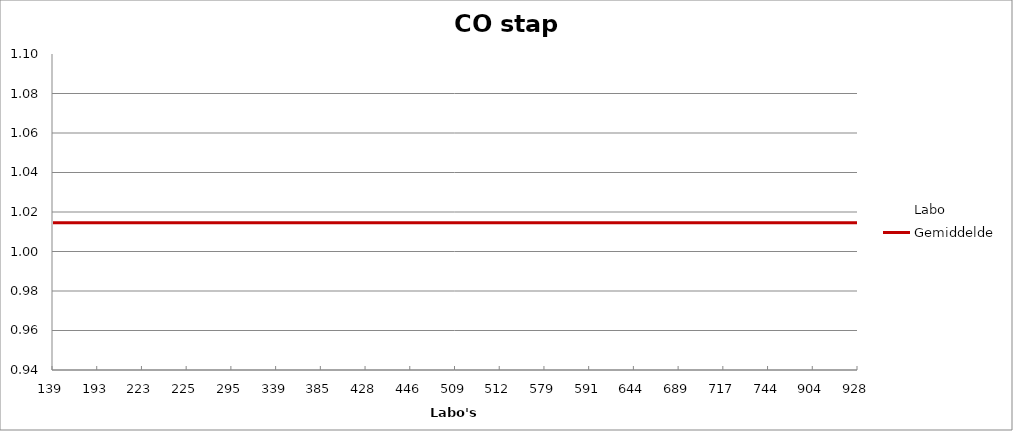
| Category | Labo | Gemiddelde |
|---|---|---|
| 139.0 | 1.048 | 1.015 |
| 193.0 | 1.096 | 1.015 |
| 223.0 | 1.016 | 1.015 |
| 225.0 | 1.032 | 1.015 |
| 295.0 | 0.984 | 1.015 |
| 339.0 | 1.016 | 1.015 |
| 385.0 | 1 | 1.015 |
| 428.0 | 1.016 | 1.015 |
| 446.0 | 1.016 | 1.015 |
| 509.0 | 1.016 | 1.015 |
| 512.0 | 1.008 | 1.015 |
| 579.0 | 1.032 | 1.015 |
| 591.0 | 1 | 1.015 |
| 644.0 | 1.024 | 1.015 |
| 689.0 | 1.024 | 1.015 |
| 717.0 | 0.976 | 1.015 |
| 744.0 | 1 | 1.015 |
| 904.0 | 1.032 | 1.015 |
| 928.0 | 0.976 | 1.015 |